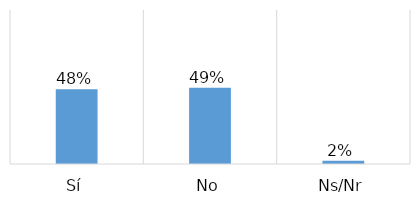
| Category | Series 0 |
|---|---|
| Sí | 0.485 |
| No | 0.495 |
| Ns/Nr | 0.02 |